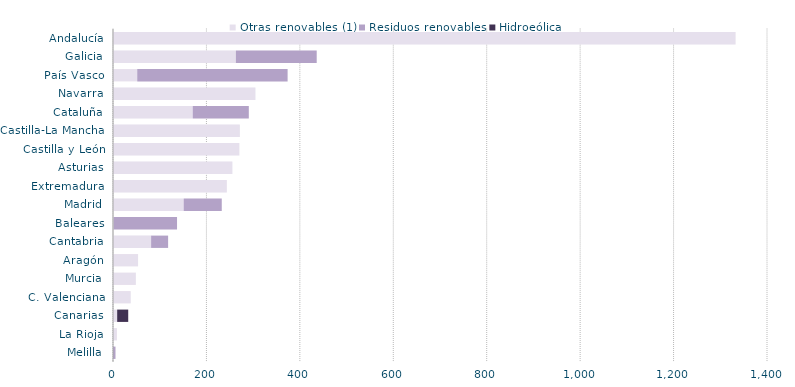
| Category | Otras renovables (1) | Residuos renovables | Hidroeólica |
|---|---|---|---|
| Melilla | 0 | 5.347 | 0 |
| La Rioja | 8.378 | 0 | 0 |
| Canarias | 8.932 | 0 | 23.656 |
| C. Valenciana | 37.886 | 0 | 0 |
| Murcia | 48.961 | 0 | 0 |
| Aragón | 53.709 | 0 | 0 |
| Cantabria | 81.568 | 36.436 | 0 |
| Baleares | 1.333 | 135.758 | 0 |
| Madrid | 151.299 | 81.51 | 0 |
| Extremadura | 243.7 | 0 | 0 |
| Asturias | 255.601 | 0 | 0 |
| Castilla y León | 270.573 | 0 | 0 |
| Castilla-La Mancha | 271.566 | 0 | 0 |
| Cataluña | 170.661 | 120.054 | 0 |
| Navarra | 304.972 | 0 | 0 |
| País Vasco | 51.845 | 321.942 | 0 |
| Galicia | 263.04 | 173.029 | 0 |
| Andalucía | 1332.762 | 0 | 0 |